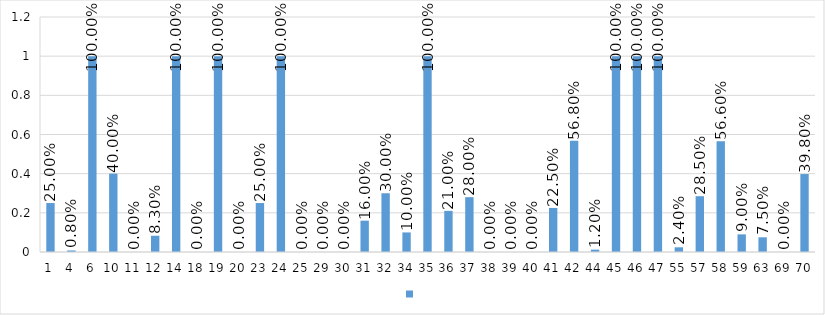
| Category | Series 0 |
|---|---|
| 1 | 0.25 |
| 4 | 0.008 |
| 6 | 1 |
| 10 | 0.4 |
| 11 | 0 |
| 12 | 0.083 |
| 14 | 1 |
| 18 | 0 |
| 19 | 1 |
| 20 | 0 |
| 23 | 0.25 |
| 24 | 1 |
| 25 | 0 |
| 29 | 0 |
| 30 | 0 |
| 31 | 0.16 |
| 32 | 0.3 |
| 34 | 0.1 |
| 35 | 1 |
| 36 | 0.21 |
| 37 | 0.28 |
| 38 | 0 |
| 39 | 0 |
| 40 | 0 |
| 41 | 0.225 |
| 42 | 0.568 |
| 44 | 0.012 |
| 45 | 1 |
| 46 | 1 |
| 47 | 1 |
| 55 | 0.024 |
| 57 | 0.285 |
| 58 | 0.566 |
| 59 | 0.09 |
| 63 | 0.075 |
| 69 | 0 |
| 70 | 0.398 |